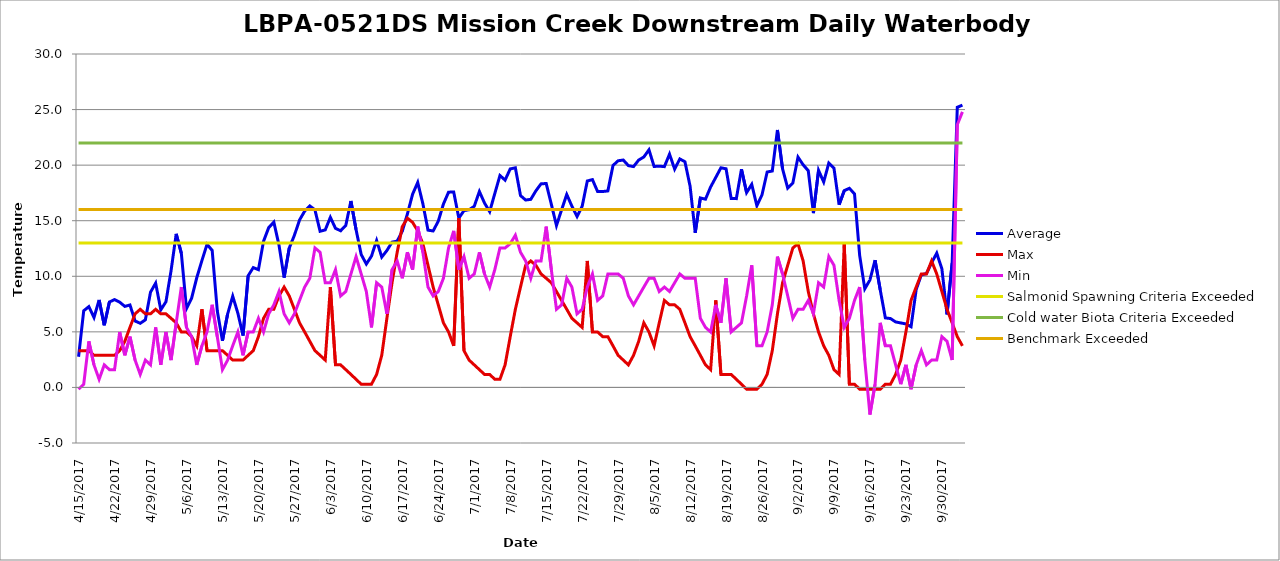
| Category | Average | Max | Min | Salmonid Spawning Criteria Exceeded | Cold water Biota Criteria Exceeded | Benchmark Exceeded |
|---|---|---|---|---|---|---|
| 4/15/17 | 2.757 | 3.31 | -0.16 | 13 | 22 | 16 |
| 4/16/17 | 6.89 | 3.31 | 0.29 | 13 | 22 | 16 |
| 4/17/17 | 7.266 | 3.31 | 4.15 | 13 | 22 | 16 |
| 4/18/17 | 6.291 | 2.89 | 2.03 | 13 | 22 | 16 |
| 4/19/17 | 7.87 | 2.89 | 0.73 | 13 | 22 | 16 |
| 4/20/17 | 5.593 | 2.89 | 2.03 | 13 | 22 | 16 |
| 4/21/17 | 7.685 | 2.89 | 1.6 | 13 | 22 | 16 |
| 4/22/17 | 7.903 | 2.89 | 1.6 | 13 | 22 | 16 |
| 4/23/17 | 7.674 | 3.31 | 4.99 | 13 | 22 | 16 |
| 4/24/17 | 7.29 | 4.15 | 2.89 | 13 | 22 | 16 |
| 4/25/17 | 7.42 | 5.4 | 4.57 | 13 | 22 | 16 |
| 4/26/17 | 5.977 | 6.62 | 2.46 | 13 | 22 | 16 |
| 4/27/17 | 5.771 | 7.03 | 1.17 | 13 | 22 | 16 |
| 4/28/17 | 6.082 | 6.62 | 2.46 | 13 | 22 | 16 |
| 4/29/17 | 8.569 | 6.62 | 2.03 | 13 | 22 | 16 |
| 4/30/17 | 9.382 | 7.03 | 5.4 | 13 | 22 | 16 |
| 5/1/17 | 6.979 | 6.62 | 2.03 | 13 | 22 | 16 |
| 5/2/17 | 7.705 | 6.62 | 4.99 | 13 | 22 | 16 |
| 5/3/17 | 10.501 | 6.22 | 2.46 | 13 | 22 | 16 |
| 5/4/17 | 13.818 | 5.81 | 5.81 | 13 | 22 | 16 |
| 5/5/17 | 12.072 | 4.99 | 9.03 | 13 | 22 | 16 |
| 5/6/17 | 7.091 | 4.99 | 5.4 | 13 | 22 | 16 |
| 5/7/17 | 8.035 | 4.57 | 4.57 | 13 | 22 | 16 |
| 5/8/17 | 9.867 | 3.74 | 2.03 | 13 | 22 | 16 |
| 5/9/17 | 11.41 | 7.03 | 3.74 | 13 | 22 | 16 |
| 5/10/17 | 12.878 | 3.31 | 4.99 | 13 | 22 | 16 |
| 5/11/17 | 12.328 | 3.31 | 7.43 | 13 | 22 | 16 |
| 5/12/17 | 6.873 | 3.31 | 4.57 | 13 | 22 | 16 |
| 5/13/17 | 4.194 | 3.31 | 1.6 | 13 | 22 | 16 |
| 5/14/17 | 6.595 | 2.89 | 2.46 | 13 | 22 | 16 |
| 5/15/17 | 8.207 | 2.46 | 3.74 | 13 | 22 | 16 |
| 5/16/17 | 6.674 | 2.46 | 4.99 | 13 | 22 | 16 |
| 5/17/17 | 4.67 | 2.46 | 2.89 | 13 | 22 | 16 |
| 5/18/17 | 10.041 | 2.89 | 4.99 | 13 | 22 | 16 |
| 5/19/17 | 10.784 | 3.31 | 4.99 | 13 | 22 | 16 |
| 5/20/17 | 10.594 | 4.57 | 6.22 | 13 | 22 | 16 |
| 5/21/17 | 13.165 | 6.22 | 4.99 | 13 | 22 | 16 |
| 5/22/17 | 14.378 | 7.03 | 6.62 | 13 | 22 | 16 |
| 5/23/17 | 14.87 | 7.03 | 7.43 | 13 | 22 | 16 |
| 5/24/17 | 12.807 | 8.23 | 8.63 | 13 | 22 | 16 |
| 5/25/17 | 9.88 | 9.03 | 6.62 | 13 | 22 | 16 |
| 5/26/17 | 12.543 | 8.23 | 5.81 | 13 | 22 | 16 |
| 5/27/17 | 13.688 | 7.03 | 6.62 | 13 | 22 | 16 |
| 5/28/17 | 15.065 | 5.81 | 7.83 | 13 | 22 | 16 |
| 5/29/17 | 15.862 | 4.99 | 9.03 | 13 | 22 | 16 |
| 5/30/17 | 16.328 | 4.15 | 9.82 | 13 | 22 | 16 |
| 5/31/17 | 15.974 | 3.31 | 12.55 | 13 | 22 | 16 |
| 6/1/17 | 14.049 | 2.89 | 12.16 | 13 | 22 | 16 |
| 6/2/17 | 14.172 | 2.46 | 9.42 | 13 | 22 | 16 |
| 6/3/17 | 15.304 | 9.03 | 9.42 | 13 | 22 | 16 |
| 6/4/17 | 14.312 | 2.03 | 10.6 | 13 | 22 | 16 |
| 6/5/17 | 14.096 | 2.03 | 8.23 | 13 | 22 | 16 |
| 6/6/17 | 14.578 | 1.6 | 8.63 | 13 | 22 | 16 |
| 6/7/17 | 16.774 | 1.17 | 10.21 | 13 | 22 | 16 |
| 6/8/17 | 14.195 | 0.73 | 11.77 | 13 | 22 | 16 |
| 6/9/17 | 11.958 | 0.29 | 10.21 | 13 | 22 | 16 |
| 6/10/17 | 11.104 | 0.29 | 8.63 | 13 | 22 | 16 |
| 6/11/17 | 11.815 | 0.29 | 5.4 | 13 | 22 | 16 |
| 6/12/17 | 13.218 | 1.17 | 9.42 | 13 | 22 | 16 |
| 6/13/17 | 11.729 | 2.89 | 9.03 | 13 | 22 | 16 |
| 6/14/17 | 12.318 | 6.22 | 6.62 | 13 | 22 | 16 |
| 6/15/17 | 13.069 | 9.42 | 10.6 | 13 | 22 | 16 |
| 6/16/17 | 13.167 | 12.16 | 11.38 | 13 | 22 | 16 |
| 6/17/17 | 14.06 | 14.47 | 9.82 | 13 | 22 | 16 |
| 6/18/17 | 15.624 | 15.23 | 12.16 | 13 | 22 | 16 |
| 6/19/17 | 17.384 | 14.85 | 10.6 | 13 | 22 | 16 |
| 6/20/17 | 18.444 | 14.09 | 14.47 | 13 | 22 | 16 |
| 6/21/17 | 16.531 | 12.93 | 12.16 | 13 | 22 | 16 |
| 6/22/17 | 14.15 | 10.99 | 9.03 | 13 | 22 | 16 |
| 6/23/17 | 14.078 | 9.03 | 8.23 | 13 | 22 | 16 |
| 6/24/17 | 14.958 | 7.43 | 8.63 | 13 | 22 | 16 |
| 6/25/17 | 16.501 | 5.81 | 9.82 | 13 | 22 | 16 |
| 6/26/17 | 17.568 | 4.99 | 12.55 | 13 | 22 | 16 |
| 6/27/17 | 17.584 | 3.74 | 14.09 | 13 | 22 | 16 |
| 6/28/17 | 15.234 | 15.23 | 10.6 | 13 | 22 | 16 |
| 6/29/17 | 15.907 | 3.31 | 11.77 | 13 | 22 | 16 |
| 6/30/17 | 15.991 | 2.46 | 9.82 | 13 | 22 | 16 |
| 7/1/17 | 16.3 | 2.03 | 10.21 | 13 | 22 | 16 |
| 7/2/17 | 17.628 | 1.6 | 12.16 | 13 | 22 | 16 |
| 7/3/17 | 16.588 | 1.17 | 10.21 | 13 | 22 | 16 |
| 7/4/17 | 15.813 | 1.17 | 9.03 | 13 | 22 | 16 |
| 7/5/17 | 17.451 | 0.73 | 10.6 | 13 | 22 | 16 |
| 7/6/17 | 19.068 | 0.73 | 12.55 | 13 | 22 | 16 |
| 7/7/17 | 18.653 | 2.03 | 12.55 | 13 | 22 | 16 |
| 7/8/17 | 19.661 | 4.57 | 12.93 | 13 | 22 | 16 |
| 7/9/17 | 19.76 | 7.03 | 13.7 | 13 | 22 | 16 |
| 7/10/17 | 17.262 | 9.03 | 12.16 | 13 | 22 | 16 |
| 7/11/17 | 16.862 | 10.99 | 11.38 | 13 | 22 | 16 |
| 7/12/17 | 16.922 | 11.38 | 9.82 | 13 | 22 | 16 |
| 7/13/17 | 17.695 | 10.99 | 11.38 | 13 | 22 | 16 |
| 7/14/17 | 18.317 | 10.21 | 11.38 | 13 | 22 | 16 |
| 7/15/17 | 18.35 | 9.82 | 14.47 | 13 | 22 | 16 |
| 7/16/17 | 16.48 | 9.42 | 10.6 | 13 | 22 | 16 |
| 7/17/17 | 14.562 | 8.63 | 7.03 | 13 | 22 | 16 |
| 7/18/17 | 15.991 | 7.83 | 7.43 | 13 | 22 | 16 |
| 7/19/17 | 17.359 | 7.03 | 9.82 | 13 | 22 | 16 |
| 7/20/17 | 16.315 | 6.22 | 9.03 | 13 | 22 | 16 |
| 7/21/17 | 15.379 | 5.81 | 6.62 | 13 | 22 | 16 |
| 7/22/17 | 16.298 | 5.4 | 7.03 | 13 | 22 | 16 |
| 7/23/17 | 18.577 | 11.38 | 9.03 | 13 | 22 | 16 |
| 7/24/17 | 18.696 | 4.99 | 10.21 | 13 | 22 | 16 |
| 7/25/17 | 17.627 | 4.99 | 7.83 | 13 | 22 | 16 |
| 7/26/17 | 17.625 | 4.57 | 8.23 | 13 | 22 | 16 |
| 7/27/17 | 17.681 | 4.57 | 10.21 | 13 | 22 | 16 |
| 7/28/17 | 19.969 | 3.74 | 10.21 | 13 | 22 | 16 |
| 7/29/17 | 20.394 | 2.89 | 10.21 | 13 | 22 | 16 |
| 7/30/17 | 20.46 | 2.46 | 9.82 | 13 | 22 | 16 |
| 7/31/17 | 19.955 | 2.03 | 8.23 | 13 | 22 | 16 |
| 8/1/17 | 19.872 | 2.89 | 7.43 | 13 | 22 | 16 |
| 8/2/17 | 20.458 | 4.15 | 8.23 | 13 | 22 | 16 |
| 8/3/17 | 20.736 | 5.81 | 9.03 | 13 | 22 | 16 |
| 8/4/17 | 21.38 | 4.99 | 9.82 | 13 | 22 | 16 |
| 8/5/17 | 19.88 | 3.74 | 9.82 | 13 | 22 | 16 |
| 8/6/17 | 19.91 | 5.81 | 8.63 | 13 | 22 | 16 |
| 8/7/17 | 19.865 | 7.83 | 9.03 | 13 | 22 | 16 |
| 8/8/17 | 20.989 | 7.43 | 8.63 | 13 | 22 | 16 |
| 8/9/17 | 19.64 | 7.43 | 9.42 | 13 | 22 | 16 |
| 8/10/17 | 20.56 | 7.03 | 10.21 | 13 | 22 | 16 |
| 8/11/17 | 20.304 | 5.81 | 9.82 | 13 | 22 | 16 |
| 8/12/17 | 18.114 | 4.57 | 9.82 | 13 | 22 | 16 |
| 8/13/17 | 13.91 | 3.74 | 9.82 | 13 | 22 | 16 |
| 8/14/17 | 17.048 | 2.89 | 6.22 | 13 | 22 | 16 |
| 8/15/17 | 16.938 | 2.03 | 5.4 | 13 | 22 | 16 |
| 8/16/17 | 18.037 | 1.6 | 4.99 | 13 | 22 | 16 |
| 8/17/17 | 18.893 | 7.83 | 7.43 | 13 | 22 | 16 |
| 8/18/17 | 19.76 | 1.17 | 5.81 | 13 | 22 | 16 |
| 8/19/17 | 19.673 | 1.17 | 9.82 | 13 | 22 | 16 |
| 8/20/17 | 16.994 | 1.17 | 4.99 | 13 | 22 | 16 |
| 8/21/17 | 16.988 | 0.73 | 5.4 | 13 | 22 | 16 |
| 8/22/17 | 19.635 | 0.29 | 5.81 | 13 | 22 | 16 |
| 8/23/17 | 17.53 | -0.16 | 8.23 | 13 | 22 | 16 |
| 8/24/17 | 18.272 | -0.16 | 10.99 | 13 | 22 | 16 |
| 8/25/17 | 16.347 | -0.16 | 3.74 | 13 | 22 | 16 |
| 8/26/17 | 17.331 | 0.29 | 3.74 | 13 | 22 | 16 |
| 8/27/17 | 19.386 | 1.17 | 4.99 | 13 | 22 | 16 |
| 8/28/17 | 19.478 | 3.31 | 7.43 | 13 | 22 | 16 |
| 8/29/17 | 23.165 | 6.62 | 11.77 | 13 | 22 | 16 |
| 8/30/17 | 19.668 | 9.42 | 10.21 | 13 | 22 | 16 |
| 8/31/17 | 17.932 | 10.99 | 8.23 | 13 | 22 | 16 |
| 9/1/17 | 18.398 | 12.55 | 6.22 | 13 | 22 | 16 |
| 9/2/17 | 20.73 | 12.93 | 7.03 | 13 | 22 | 16 |
| 9/3/17 | 20.027 | 11.38 | 7.03 | 13 | 22 | 16 |
| 9/4/17 | 19.495 | 8.63 | 7.83 | 13 | 22 | 16 |
| 9/5/17 | 15.682 | 6.62 | 6.62 | 13 | 22 | 16 |
| 9/6/17 | 19.533 | 4.99 | 9.42 | 13 | 22 | 16 |
| 9/7/17 | 18.486 | 3.74 | 9.03 | 13 | 22 | 16 |
| 9/8/17 | 20.193 | 2.89 | 11.77 | 13 | 22 | 16 |
| 9/9/17 | 19.731 | 1.6 | 10.99 | 13 | 22 | 16 |
| 9/10/17 | 16.445 | 1.17 | 7.83 | 13 | 22 | 16 |
| 9/11/17 | 17.7 | 12.93 | 5.4 | 13 | 22 | 16 |
| 9/12/17 | 17.916 | 0.29 | 6.22 | 13 | 22 | 16 |
| 9/13/17 | 17.415 | 0.29 | 7.83 | 13 | 22 | 16 |
| 9/14/17 | 11.883 | -0.16 | 9.03 | 13 | 22 | 16 |
| 9/15/17 | 8.869 | -0.16 | 2.46 | 13 | 22 | 16 |
| 9/16/17 | 9.67 | -0.16 | -2.44 | 13 | 22 | 16 |
| 9/17/17 | 11.452 | -0.16 | 0.29 | 13 | 22 | 16 |
| 9/18/17 | 8.789 | -0.16 | 5.81 | 13 | 22 | 16 |
| 9/19/17 | 6.258 | 0.29 | 3.74 | 13 | 22 | 16 |
| 9/20/17 | 6.196 | 0.29 | 3.74 | 13 | 22 | 16 |
| 9/21/17 | 5.893 | 1.17 | 2.03 | 13 | 22 | 16 |
| 9/22/17 | 5.803 | 2.46 | 0.29 | 13 | 22 | 16 |
| 9/23/17 | 5.714 | 4.99 | 2.03 | 13 | 22 | 16 |
| 9/24/17 | 5.462 | 7.83 | -0.16 | 13 | 22 | 16 |
| 9/25/17 | 8.805 | 9.03 | 2.03 | 13 | 22 | 16 |
| 9/26/17 | 10.127 | 10.21 | 3.31 | 13 | 22 | 16 |
| 9/27/17 | 10.243 | 10.21 | 2.03 | 13 | 22 | 16 |
| 9/28/17 | 11.205 | 11.38 | 2.46 | 13 | 22 | 16 |
| 9/29/17 | 12.082 | 10.21 | 2.46 | 13 | 22 | 16 |
| 9/30/17 | 10.672 | 8.63 | 4.57 | 13 | 22 | 16 |
| 10/1/17 | 6.565 | 7.03 | 4.15 | 13 | 22 | 16 |
| 10/2/17 | 11.202 | 5.81 | 2.46 | 13 | 22 | 16 |
| 10/3/17 | 25.208 | 4.57 | 23.63 | 13 | 22 | 16 |
| 10/4/17 | 25.406 | 3.74 | 24.79 | 13 | 22 | 16 |